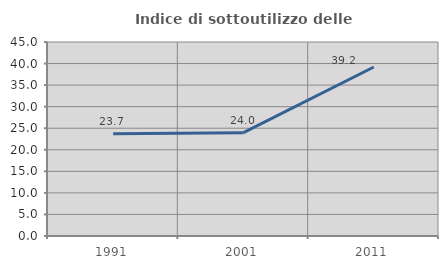
| Category | Indice di sottoutilizzo delle abitazioni  |
|---|---|
| 1991.0 | 23.729 |
| 2001.0 | 23.958 |
| 2011.0 | 39.196 |